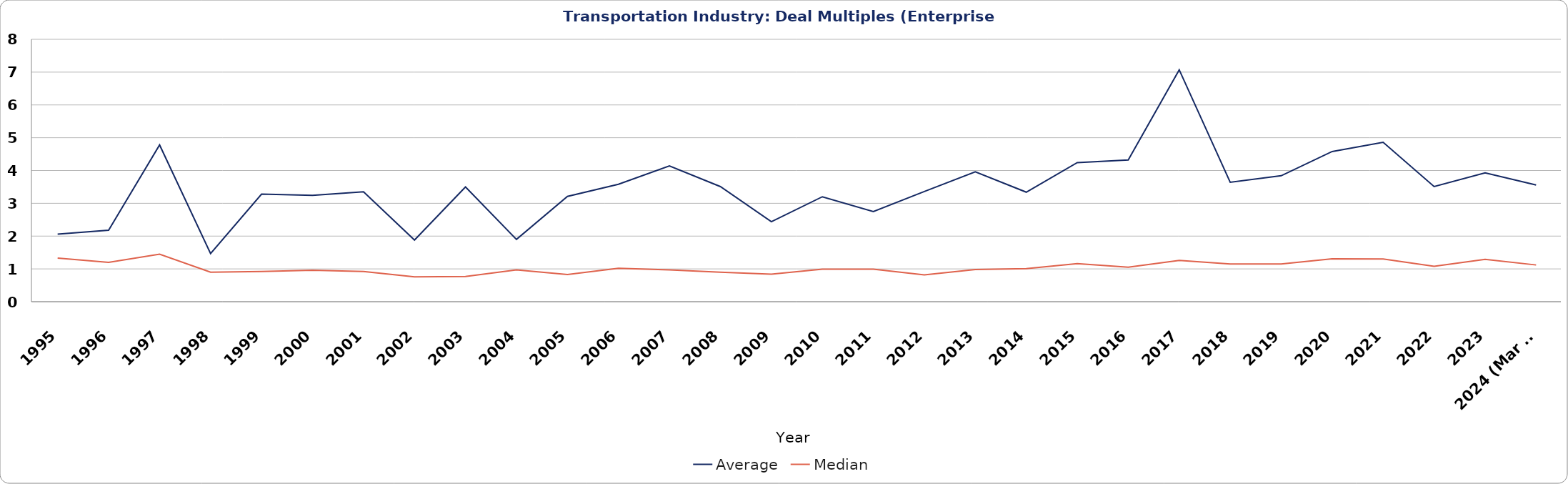
| Category | Average | Median |
|---|---|---|
| 1995 | 2.06 | 1.33 |
| 1996 | 2.18 | 1.2 |
| 1997 | 4.78 | 1.45 |
| 1998 | 1.47 | 0.9 |
| 1999 | 3.28 | 0.92 |
| 2000 | 3.24 | 0.96 |
| 2001 | 3.35 | 0.92 |
| 2002 | 1.88 | 0.76 |
| 2003 | 3.5 | 0.77 |
| 2004 | 1.9 | 0.97 |
| 2005 | 3.21 | 0.83 |
| 2006 | 3.58 | 1.02 |
| 2007 | 4.14 | 0.97 |
| 2008 | 3.51 | 0.9 |
| 2009 | 2.44 | 0.84 |
| 2010 | 3.2 | 0.99 |
| 2011 | 2.75 | 0.99 |
| 2012 | 3.36 | 0.82 |
| 2013 | 3.96 | 0.98 |
| 2014 | 3.34 | 1.01 |
| 2015 | 4.24 | 1.16 |
| 2016 | 4.32 | 1.05 |
| 2017 | 7.07 | 1.26 |
| 2018 | 3.64 | 1.15 |
| 2019 | 3.84 | 1.15 |
| 2020 | 4.58 | 1.31 |
| 2021 | 4.86 | 1.3 |
| 2022 | 3.51 | 1.08 |
| 2023 | 3.93 | 1.29 |
| 2024 (Mar 31) | 3.56 | 1.12 |